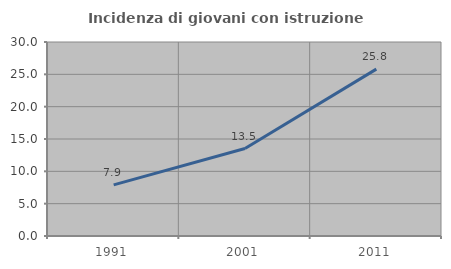
| Category | Incidenza di giovani con istruzione universitaria |
|---|---|
| 1991.0 | 7.905 |
| 2001.0 | 13.522 |
| 2011.0 | 25.81 |